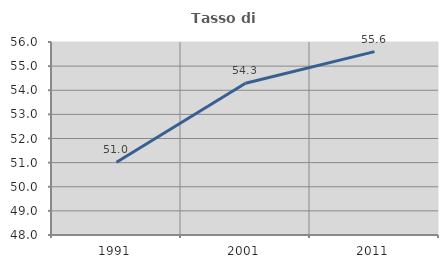
| Category | Tasso di occupazione   |
|---|---|
| 1991.0 | 51.016 |
| 2001.0 | 54.291 |
| 2011.0 | 55.6 |